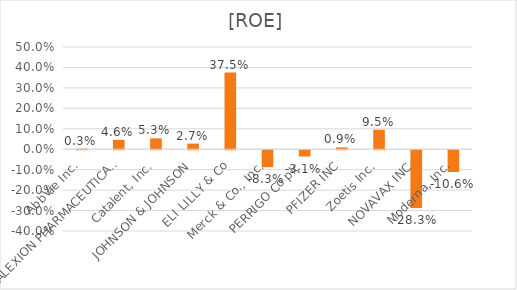
| Category | [ROE] |
|---|---|
| AbbVie Inc. | 0.003 |
| ALEXION PHARMACEUTICALS, INC. | 0.046 |
| Catalent, Inc. | 0.053 |
| JOHNSON & JOHNSON | 0.027 |
| ELI LILLY & Co | 0.375 |
| Merck & Co., Inc. | -0.083 |
| PERRIGO Co plc | -0.031 |
| PFIZER INC | 0.009 |
| Zoetis Inc. | 0.095 |
| NOVAVAX INC | -0.283 |
| Moderna, Inc. | -0.106 |